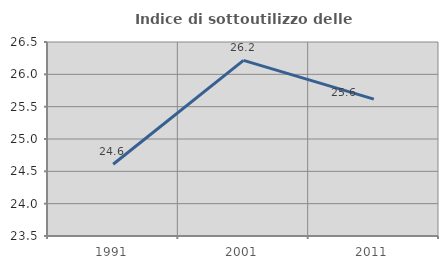
| Category | Indice di sottoutilizzo delle abitazioni  |
|---|---|
| 1991.0 | 24.61 |
| 2001.0 | 26.216 |
| 2011.0 | 25.616 |